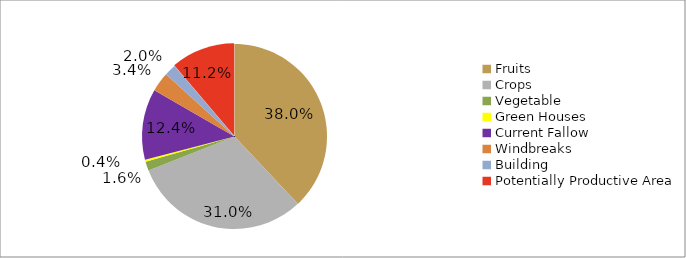
| Category | 283976 231919 11910 2825 92364 25479 15293 83913 |
|---|---|
| Fruits | 283976 |
| Crops | 231919 |
| Vegetable | 11910 |
| Green Houses | 2825 |
| Current Fallow  | 92364 |
| Windbreaks | 25479 |
| Building | 15293 |
| Potentially Productive Area | 83913 |